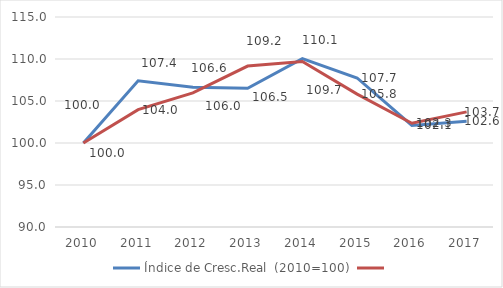
| Category | Índice de Cresc.Real  (2010=100) | Series 1 |
|---|---|---|
| 2010.0 | 100 | 100 |
| 2011.0 | 107.407 | 103.974 |
| 2012.0 | 106.623 | 105.972 |
| 2013.0 | 106.521 | 109.156 |
| 2014.0 | 110.051 | 109.706 |
| 2015.0 | 107.74 | 105.816 |
| 2016.0 | 102.098 | 102.35 |
| 2017.0 | 102.579 | 103.704 |